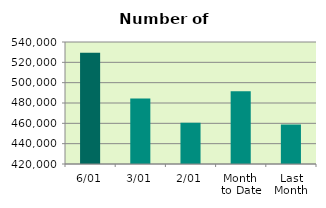
| Category | Series 0 |
|---|---|
| 6/01 | 529474 |
| 3/01 | 484546 |
| 2/01 | 460588 |
| Month 
to Date | 491536 |
| Last
Month | 458836.4 |